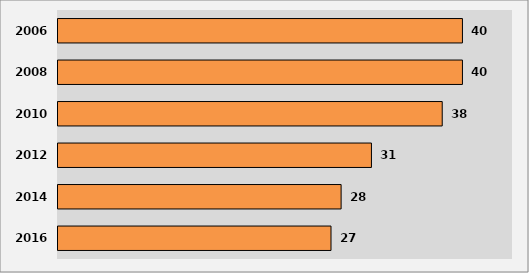
| Category | Series 1 |
|---|---|
| 2016.0 | 27 |
| 2014.0 | 28 |
| 2012.0 | 31 |
| 2010.0 | 38 |
| 2008.0 | 40 |
| 2006.0 | 40 |